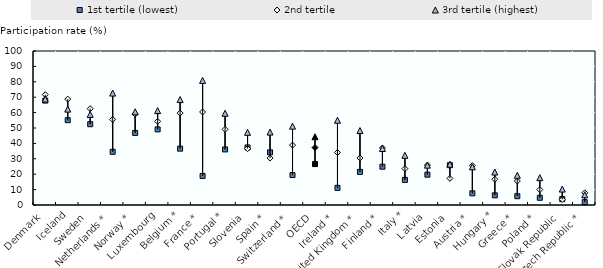
| Category | 1st tertile (lowest) | 2nd tertile | 3rd tertile (highest) |
|---|---|---|---|
| Denmark | 67.796 | 71.65 | 68.813 |
| Iceland | 55.076 | 68.742 | 62.273 |
| Sweden | 52.455 | 62.534 | 58.812 |
| Netherlands * | 34.535 | 55.531 | 72.675 |
| Norway * | 46.805 | 59.037 | 60.502 |
| Luxembourg | 49.102 | 54.349 | 61.315 |
| Belgium * | 36.578 | 59.706 | 68.475 |
| France * | 18.873 | 60.427 | 80.911 |
| Portugal * | 36.083 | 49.126 | 59.565 |
| Slovenia | 37.368 | 36.606 | 47.174 |
| Spain * | 34.184 | 30.47 | 47.359 |
| Switzerland * | 19.433 | 38.91 | 51.214 |
| OECD | 26.567 | 37.288 | 44.333 |
| Ireland * | 11.144 | 34.051 | 55.03 |
| United Kingdom * | 21.508 | 30.539 | 48.343 |
| Finland * | 24.875 | 37.037 | 36.673 |
| Italy * | 16.315 | 23.62 | 32.265 |
| Latvia | 19.703 | 25.918 | 25.878 |
| Estonia | 25.825 | 17.294 | 26.531 |
| Austria * | 7.582 | 25.587 | 24.768 |
| Hungary * | 6.278 | 16.729 | 21.402 |
| Greece * | 5.704 | 15.558 | 19.279 |
| Poland * | 4.695 | 10.014 | 17.73 |
| Slovak Republic | 3.834 | 3.57 | 10.351 |
| Czech Republic * | 1.857 | 7.901 | 6.666 |